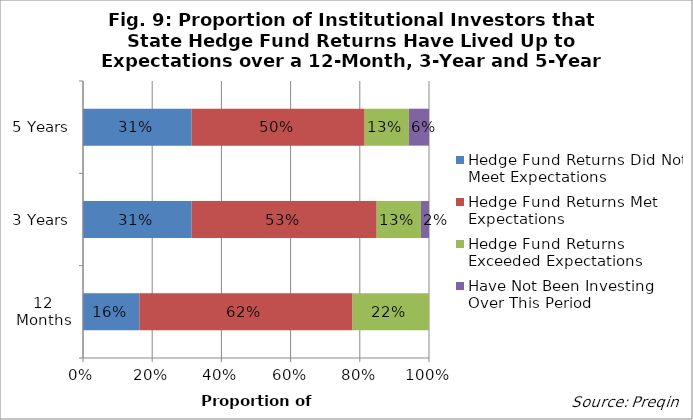
| Category | Hedge Fund Returns Did Not Meet Expectations | Hedge Fund Returns Met Expectations | Hedge Fund Returns Exceeded Expectations | Have Not Been Investing Over This Period |
|---|---|---|---|---|
| 12 Months | 0.163 | 0.616 | 0.221 | 0 |
| 3 Years | 0.314 | 0.535 | 0.128 | 0.023 |
| 5 Years | 0.314 | 0.5 | 0.128 | 0.058 |